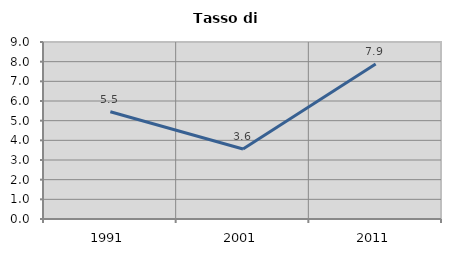
| Category | Tasso di disoccupazione   |
|---|---|
| 1991.0 | 5.455 |
| 2001.0 | 3.557 |
| 2011.0 | 7.88 |